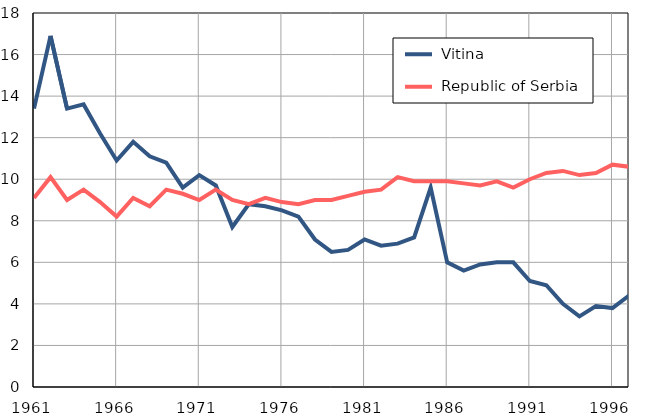
| Category |  Vitina |  Republic of Serbia |
|---|---|---|
| 1961.0 | 13.4 | 9.1 |
| 1962.0 | 16.9 | 10.1 |
| 1963.0 | 13.4 | 9 |
| 1964.0 | 13.6 | 9.5 |
| 1965.0 | 12.2 | 8.9 |
| 1966.0 | 10.9 | 8.2 |
| 1967.0 | 11.8 | 9.1 |
| 1968.0 | 11.1 | 8.7 |
| 1969.0 | 10.8 | 9.5 |
| 1970.0 | 9.6 | 9.3 |
| 1971.0 | 10.2 | 9 |
| 1972.0 | 9.7 | 9.5 |
| 1973.0 | 7.7 | 9 |
| 1974.0 | 8.8 | 8.8 |
| 1975.0 | 8.7 | 9.1 |
| 1976.0 | 8.5 | 8.9 |
| 1977.0 | 8.2 | 8.8 |
| 1978.0 | 7.1 | 9 |
| 1979.0 | 6.5 | 9 |
| 1980.0 | 6.6 | 9.2 |
| 1981.0 | 7.1 | 9.4 |
| 1982.0 | 6.8 | 9.5 |
| 1983.0 | 6.9 | 10.1 |
| 1984.0 | 7.2 | 9.9 |
| 1985.0 | 9.6 | 9.9 |
| 1986.0 | 6 | 9.9 |
| 1987.0 | 5.6 | 9.8 |
| 1988.0 | 5.9 | 9.7 |
| 1989.0 | 6 | 9.9 |
| 1990.0 | 6 | 9.6 |
| 1991.0 | 5.1 | 10 |
| 1992.0 | 4.9 | 10.3 |
| 1993.0 | 4 | 10.4 |
| 1994.0 | 3.4 | 10.2 |
| 1995.0 | 3.9 | 10.3 |
| 1996.0 | 3.8 | 10.7 |
| 1997.0 | 4.4 | 10.6 |